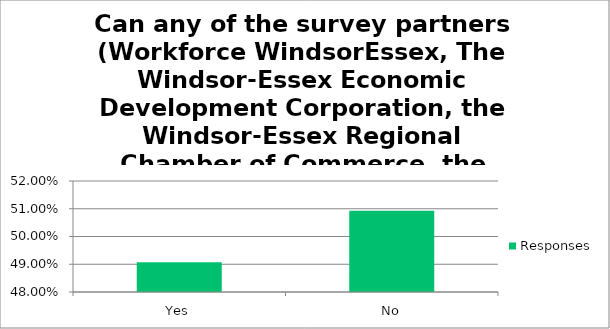
| Category | Responses |
|---|---|
| Yes | 0.491 |
| No | 0.509 |